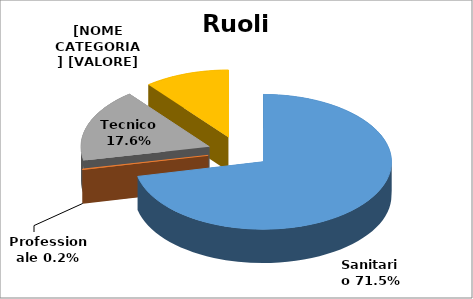
| Category | Series 0 |
|---|---|
| Sanitario | 0.715 |
| Professionale | 0.002 |
| Tecnico | 0.176 |
| Amministrativo | 0.107 |